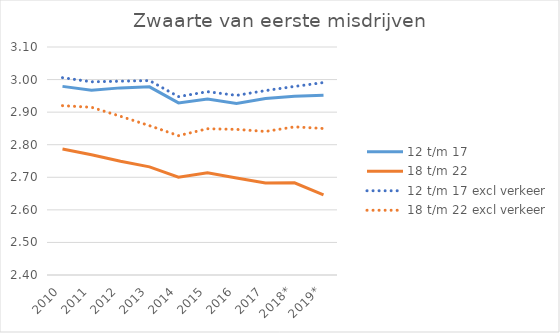
| Category | 12 t/m 17 | 18 t/m 22 | 12 t/m 17 excl verkeer | 18 t/m 22 excl verkeer |
|---|---|---|---|---|
| 2010 | 2.979 | 2.787 | 3.006 | 2.92 |
| 2011 | 2.967 | 2.769 | 2.993 | 2.915 |
| 2012 | 2.974 | 2.75 | 2.995 | 2.887 |
| 2013 | 2.978 | 2.732 | 2.997 | 2.858 |
| 2014 | 2.928 | 2.7 | 2.948 | 2.828 |
| 2015 | 2.94 | 2.714 | 2.963 | 2.849 |
| 2016 | 2.927 | 2.698 | 2.951 | 2.847 |
| 2017 | 2.942 | 2.682 | 2.966 | 2.841 |
| 2018* | 2.949 | 2.683 | 2.979 | 2.855 |
| 2019* | 2.952 | 2.646 | 2.991 | 2.85 |